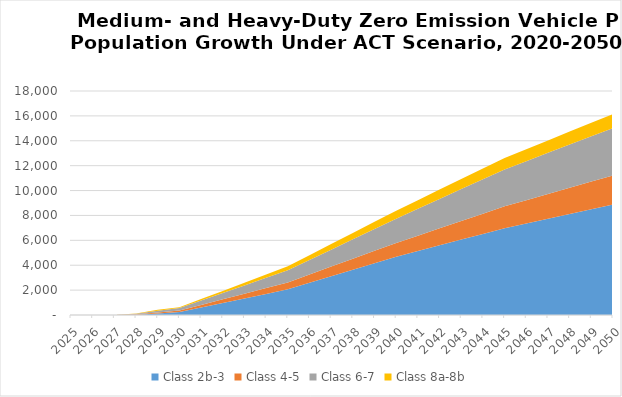
| Category | Class 2b-3 | Class 4-5 | Class 6-7 | Class 8a-8b |
|---|---|---|---|---|
| 2025.0 | 0 | 0 | 0 | 0 |
| 2026.0 | 0 | 0 | 0 | 0 |
| 2027.0 | 0 | 2.935 | 4.565 | 1.745 |
| 2028.0 | 27.543 | 27.594 | 45.964 | 17.461 |
| 2029.0 | 122.595 | 83.519 | 140.605 | 69.568 |
| 2030.0 | 240 | 120 | 200 | 60 |
| 2031.0 | 604 | 208 | 354 | 112 |
| 2032.0 | 968 | 296 | 508 | 164 |
| 2033.0 | 1332 | 384 | 662 | 216 |
| 2034.0 | 1696 | 472 | 816 | 268 |
| 2035.0 | 2060 | 560 | 970 | 320 |
| 2036.0 | 2586 | 668 | 1166 | 384 |
| 2037.0 | 3112 | 776 | 1362 | 448 |
| 2038.0 | 3638 | 884 | 1558 | 512 |
| 2039.0 | 4164 | 992 | 1754 | 576 |
| 2040.0 | 4690 | 1100 | 1950 | 640 |
| 2041.0 | 5146 | 1232 | 2154 | 696 |
| 2042.0 | 5602 | 1364 | 2358 | 752 |
| 2043.0 | 6058 | 1496 | 2562 | 808 |
| 2044.0 | 6514 | 1628 | 2766 | 864 |
| 2045.0 | 6970 | 1760 | 2970 | 920 |
| 2046.0 | 7352 | 1876 | 3136 | 962 |
| 2047.0 | 7734 | 1992 | 3302 | 1004 |
| 2048.0 | 8116 | 2108 | 3468 | 1046 |
| 2049.0 | 8498 | 2224 | 3634 | 1088 |
| 2050.0 | 8880 | 2340 | 3800 | 1130 |